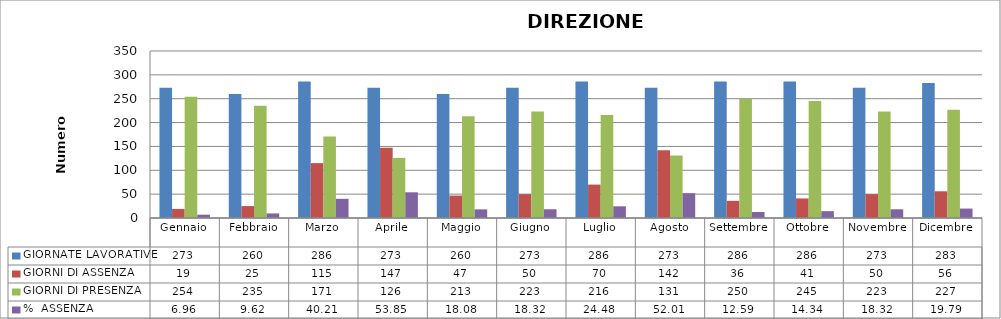
| Category | GIORNATE LAVORATIVE | GIORNI DI ASSENZA | GIORNI DI PRESENZA | %  ASSENZA |
|---|---|---|---|---|
| Gennaio | 273 | 19 | 254 | 6.96 |
| Febbraio | 260 | 25 | 235 | 9.615 |
| Marzo | 286 | 115 | 171 | 40.21 |
| Aprile | 273 | 147 | 126 | 53.846 |
| Maggio | 260 | 47 | 213 | 18.077 |
| Giugno | 273 | 50 | 223 | 18.315 |
| Luglio | 286 | 70 | 216 | 24.476 |
| Agosto | 273 | 142 | 131 | 52.015 |
| Settembre | 286 | 36 | 250 | 12.587 |
| Ottobre | 286 | 41 | 245 | 14.336 |
| Novembre | 273 | 50 | 223 | 18.315 |
| Dicembre | 283 | 56 | 227 | 19.788 |